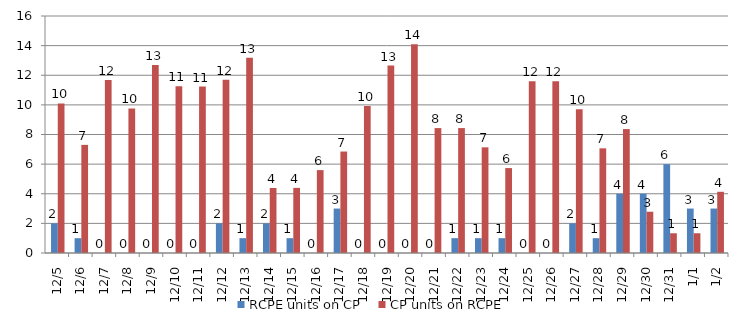
| Category | RCPE units on CP | CP units on RCPE |
|---|---|---|
| 2015-12-05 | 2 | 10.1 |
| 2015-12-06 | 1 | 7.3 |
| 2015-12-07 | 0 | 11.68 |
| 2015-12-08 | 0 | 9.76 |
| 2015-12-09 | 0 | 12.697 |
| 2015-12-10 | 0 | 11.25 |
| 2015-12-11 | 0 | 11.237 |
| 2015-12-12 | 2 | 11.703 |
| 2015-12-13 | 1 | 13.183 |
| 2015-12-14 | 2 | 4.387 |
| 2015-12-15 | 1 | 4.397 |
| 2015-12-16 | 0 | 5.597 |
| 2015-12-17 | 3 | 6.85 |
| 2015-12-18 | 0 | 9.92 |
| 2015-12-19 | 0 | 12.653 |
| 2015-12-20 | 0 | 14.087 |
| 2015-12-21 | 0 | 8.433 |
| 2015-12-22 | 1 | 8.433 |
| 2015-12-23 | 1 | 7.133 |
| 2015-12-24 | 1 | 5.733 |
| 2015-12-25 | 0 | 11.6 |
| 2015-12-26 | 0 | 11.6 |
| 2015-12-27 | 2 | 9.7 |
| 2015-12-28 | 1 | 7.067 |
| 2015-12-29 | 4 | 8.367 |
| 2015-12-30 | 4 | 2.787 |
| 2015-12-31 | 6 | 1.333 |
| 2016-01-01 | 3 | 1.333 |
| 2016-01-02 | 3 | 4.133 |